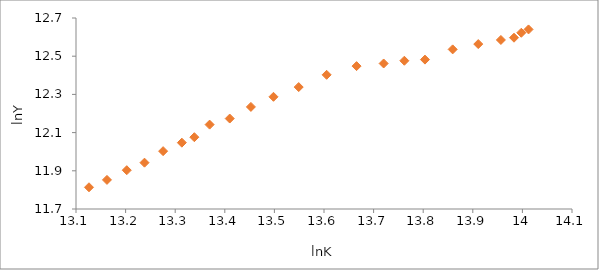
| Category | lnY |
|---|---|
| 13.126205985121778 | 11.814 |
| 13.162422200783556 | 11.852 |
| 13.202371622945591 | 11.903 |
| 13.238119471312642 | 11.942 |
| 13.275643964524976 | 12.003 |
| 13.313413396762122 | 12.047 |
| 13.33856931905995 | 12.076 |
| 13.369378130872978 | 12.142 |
| 13.409942444551245 | 12.174 |
| 13.45263643878272 | 12.234 |
| 13.498137367850983 | 12.287 |
| 13.548981834160656 | 12.338 |
| 13.605310378635993 | 12.403 |
| 13.665673228916795 | 12.448 |
| 13.72027967501587 | 12.462 |
| 13.762011675159092 | 12.476 |
| 13.803548294531412 | 12.482 |
| 13.859416432434873 | 12.536 |
| 13.910991632256213 | 12.564 |
| 13.956641996933348 | 12.585 |
| 13.983068669430741 | 12.597 |
| 13.997765445869241 | 12.623 |
| 14.012363520604138 | 12.64 |